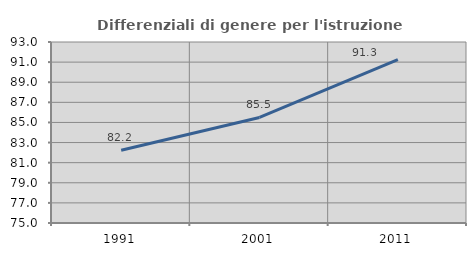
| Category | Differenziali di genere per l'istruzione superiore |
|---|---|
| 1991.0 | 82.228 |
| 2001.0 | 85.5 |
| 2011.0 | 91.256 |